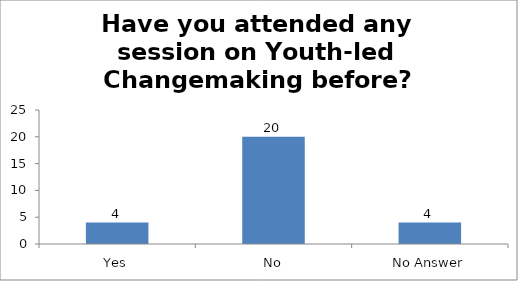
| Category | Have you attended any session on Youth-led Changemaking before? |
|---|---|
| Yes | 4 |
| No | 20 |
| No Answer | 4 |